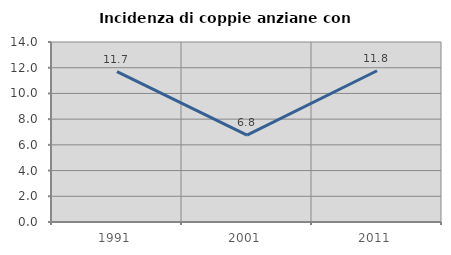
| Category | Incidenza di coppie anziane con figli |
|---|---|
| 1991.0 | 11.688 |
| 2001.0 | 6.757 |
| 2011.0 | 11.765 |